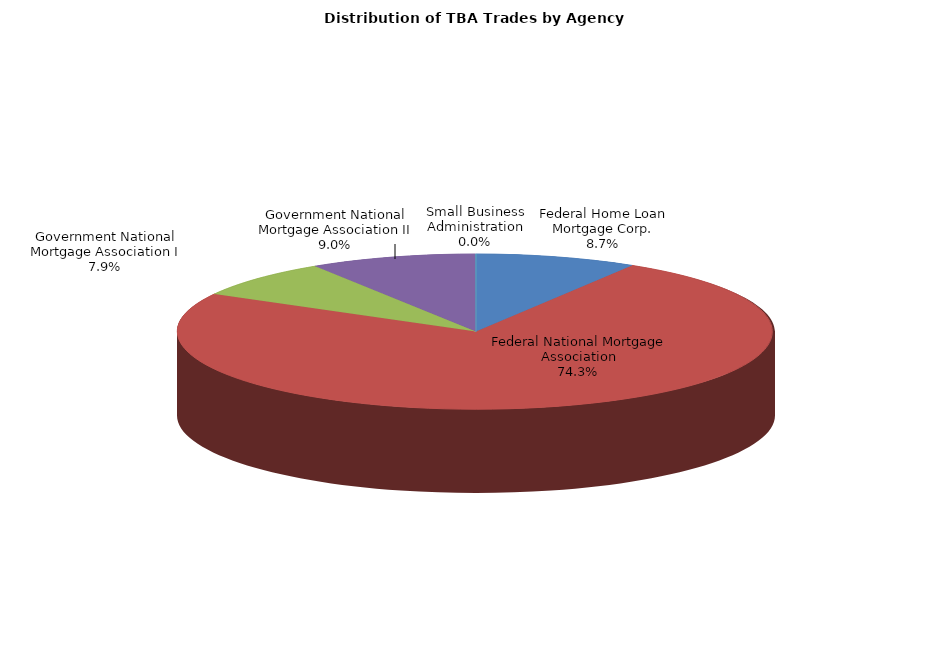
| Category | Series 0 |
|---|---|
| Federal Home Loan Mortgage Corp. | 631.171 |
| Federal National Mortgage Association | 5365.48 |
| Government National Mortgage Association I | 572.262 |
| Government National Mortgage Association II | 650.671 |
| Small Business Administration | 1.119 |